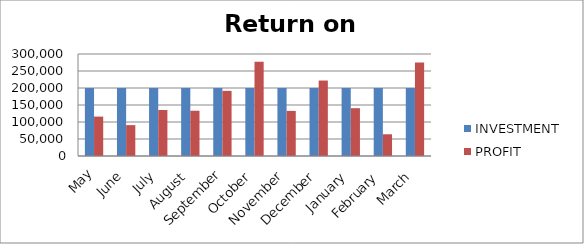
| Category | INVESTMENT  | PROFIT |
|---|---|---|
| May | 200000 | 115878 |
| June | 200000 | 90800 |
| July | 200000 | 135218 |
| August | 200000 | 133151 |
| September | 200000 | 191545 |
| October | 200000 | 276993 |
| November | 200000 | 132667 |
| December | 200000 | 221931 |
| January | 200000 | 140643 |
| February | 200000 | 63900 |
| March | 200000 | 275350 |